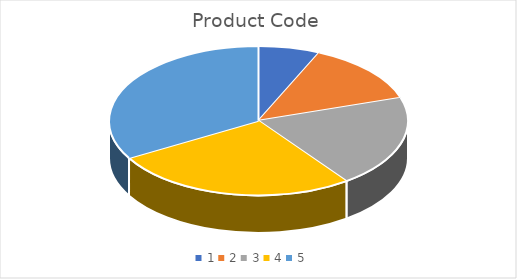
| Category | Product Code | Sales Amount |
|---|---|---|
| 0 | 10 | 100 |
| 1 | 20 | 200 |
| 2 | 30 | 300 |
| 3 | 40 | 400 |
| 4 | 50 | 500 |